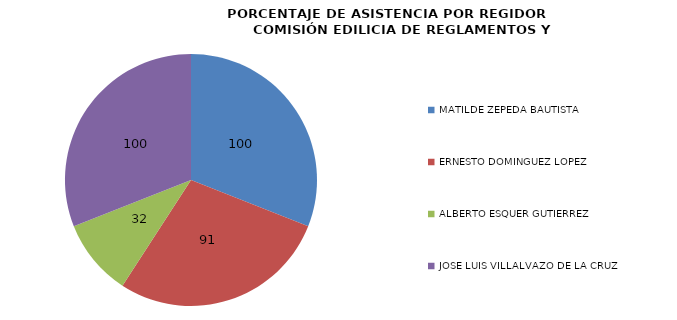
| Category | Series 0 |
|---|---|
| MATILDE ZEPEDA BAUTISTA | 100 |
| ERNESTO DOMINGUEZ LOPEZ  | 90.909 |
| ALBERTO ESQUER GUTIERREZ | 31.818 |
| JOSE LUIS VILLALVAZO DE LA CRUZ  | 100 |